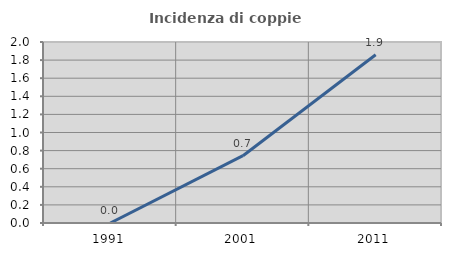
| Category | Incidenza di coppie miste |
|---|---|
| 1991.0 | 0 |
| 2001.0 | 0.744 |
| 2011.0 | 1.86 |